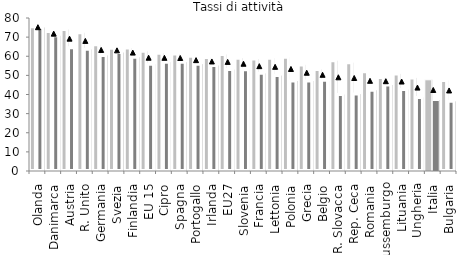
| Category | Uomini | Donne |
|---|---|---|
| Olanda | 75.38 | 75 |
| Danimarca | 72.935 | 70.706 |
| Austria | 73.988 | 64.461 |
| R. Unito | 72.31 | 63.604 |
| Germania | 66.076 | 60.423 |
| Svezia | 64.217 | 61.905 |
| Finlandia | 64.269 | 59.498 |
| EU 15 | 62.581 | 55.81 |
| Cipro | 61.566 | 56.897 |
| Spagna | 61.191 | 56.918 |
| Portogallo | 59.968 | 55.874 |
| Irlanda | 59.377 | 55.209 |
| EU27 | 60.941 | 53.053 |
| Slovenia | 59.009 | 52.964 |
| Francia | 58.608 | 51.049 |
| Lettonia | 58.929 | 49.879 |
| Polonia | 59.434 | 47.05 |
| Grecia | 55.487 | 47.113 |
| Belgio | 53.074 | 47.506 |
| R. Slovacca | 57.608 | 40.007 |
| Rep. Ceca | 56.596 | 40.204 |
| Romania | 51.866 | 42.224 |
| Lussemburgo | 48.842 | 45.022 |
| Lituania | 50.753 | 42.568 |
| Ungheria | 48.671 | 38.431 |
| Italia | 47.694 | 36.86 |
| Bulgaria | 47.298 | 36.411 |